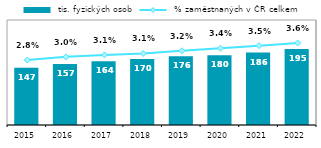
| Category |  tis. fyzických osob |
|---|---|
| 2015 | 147.389 |
| 2016 | 157.142 |
| 2017 | 164.209 |
| 2018 | 169.722 |
| 2019 | 176.484 |
| 2020 | 179.562 |
| 2021 | 186.17 |
| 2022 | 195.495 |